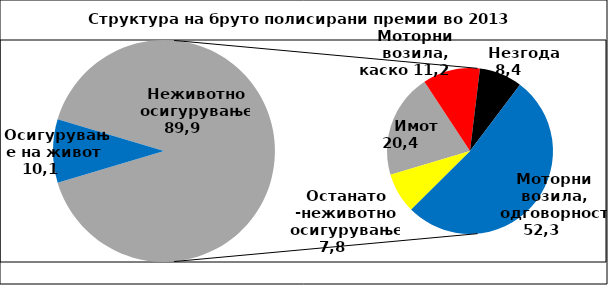
| Category | Series 0 |
|---|---|
| 0 | 10.141 |
| 1 | 20.353 |
| 2 | 11.167 |
| 3 | 8.367 |
| 4 | 52.29 |
| 5 | 7.823 |